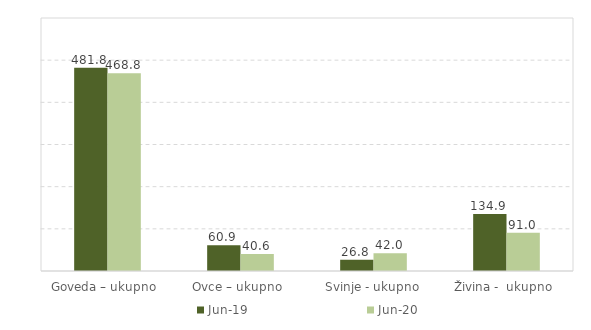
| Category | Jun-19 | Jun-20 |
|---|---|---|
| Goveda – ukupno  | 481.8 | 468.8 |
| Ovce – ukupno  | 60.9 | 40.6 |
| Svinje - ukupno | 26.8 | 42 |
| Živina -  ukupno  | 134.9 | 91 |